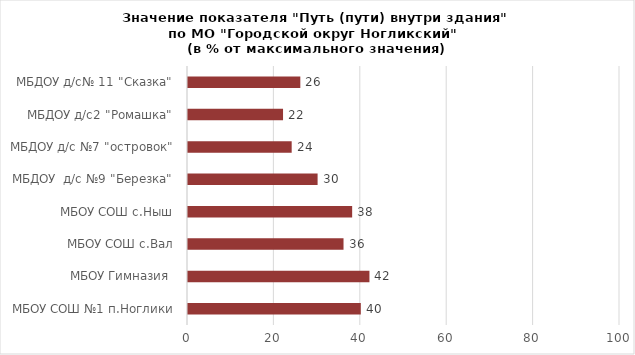
| Category | Series 0 |
|---|---|
| МБОУ СОШ №1 п.Ноглики | 40 |
| МБОУ Гимназия  | 42 |
| МБОУ СОШ с.Вал | 36 |
| МБОУ СОШ с.Ныш | 38 |
| МБДОУ  д/с №9 "Березка" | 30 |
| МБДОУ д/с №7 "островок" | 24 |
| МБДОУ д/с2 "Ромашка" | 22 |
| МБДОУ д/с№ 11 "Сказка" | 26 |